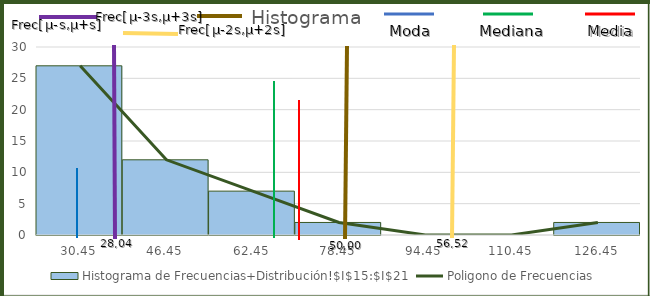
| Category | Histograma de Frecuencias+Distribución!$I$15:$I$21 |
|---|---|
| 30.450000000000003 | 27 |
| 46.45 | 12 |
| 62.45 | 7 |
| 78.45 | 2 |
| 94.45 | 0 |
| 110.45 | 0 |
| 126.44999999999999 | 2 |